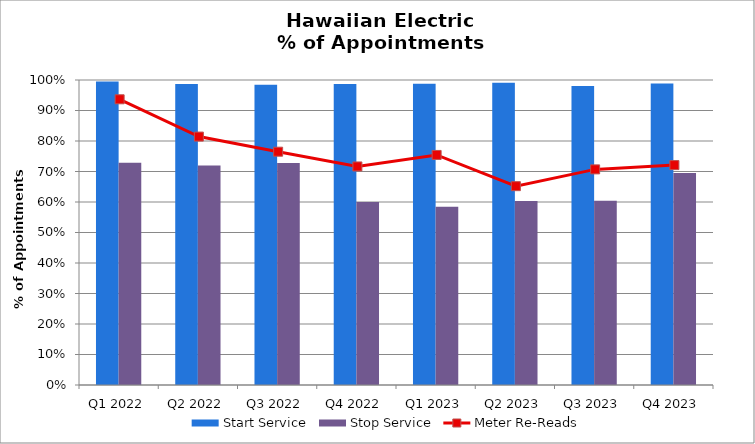
| Category | Start Service | Stop Service |
|---|---|---|
| Q1 2022 | 0.995 | 0.729 |
| Q2 2022 | 0.987 | 0.72 |
| Q3 2022 | 0.984 | 0.728 |
| Q4 2022 | 0.987 | 0.6 |
| Q1 2023 | 0.987 | 0.584 |
| Q2 2023 | 0.991 | 0.604 |
| Q3 2023 | 0.981 | 0.604 |
| Q4 2023 | 0.988 | 0.695 |